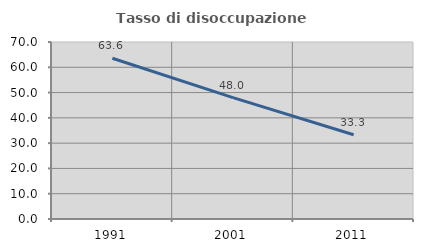
| Category | Tasso di disoccupazione giovanile  |
|---|---|
| 1991.0 | 63.571 |
| 2001.0 | 48 |
| 2011.0 | 33.333 |